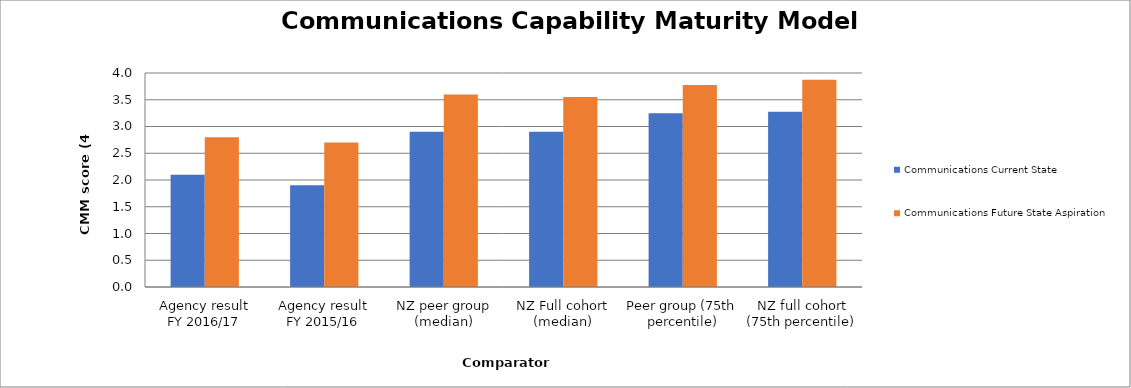
| Category | Communications Current State | Communications Future State Aspiration |
|---|---|---|
| Agency result
FY 2016/17 | 2.1 | 2.8 |
| Agency result
FY 2015/16 | 1.9 | 2.7 |
| NZ peer group (median) | 2.9 | 3.6 |
| NZ Full cohort (median) | 2.9 | 3.55 |
| Peer group (75th percentile) | 3.25 | 3.775 |
| NZ full cohort (75th percentile) | 3.275 | 3.875 |